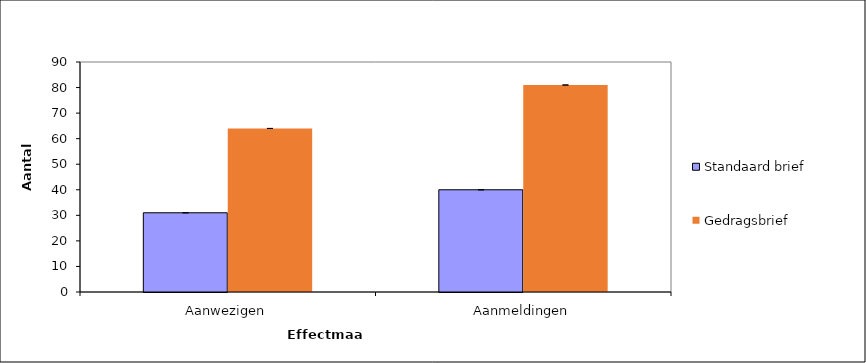
| Category | Standaard brief | Gedragsbrief |
|---|---|---|
| Aanwezigen | 31 | 64 |
| Aanmeldingen | 40 | 81 |